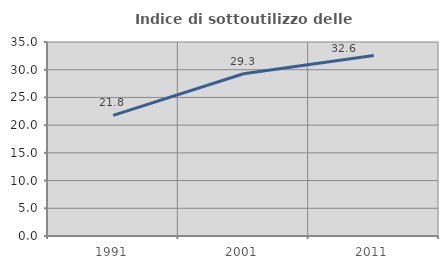
| Category | Indice di sottoutilizzo delle abitazioni  |
|---|---|
| 1991.0 | 21.752 |
| 2001.0 | 29.275 |
| 2011.0 | 32.558 |